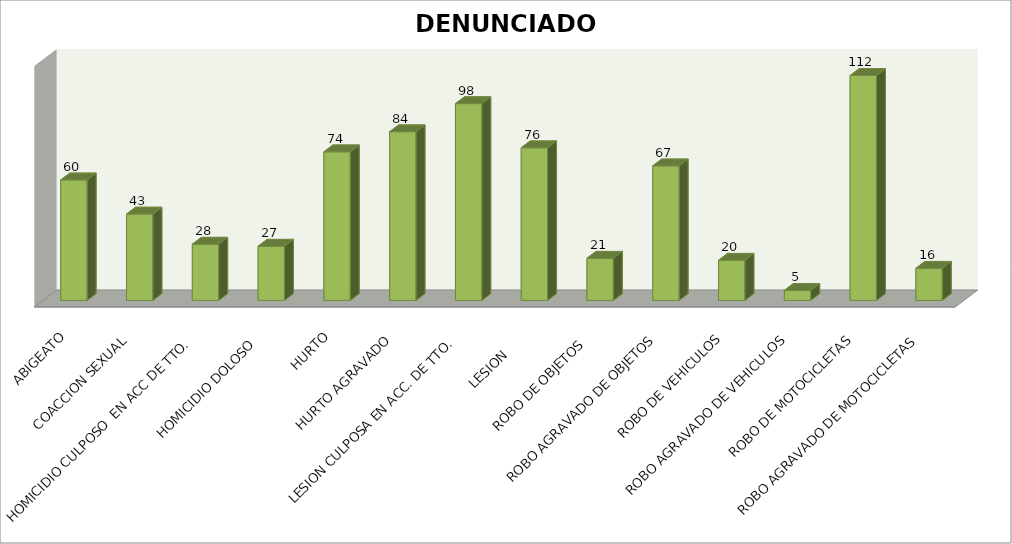
| Category | DENUNCIADOS |
|---|---|
| ABIGEATO | 60 |
| COACCION SEXUAL | 43 |
| HOMICIDIO CULPOSO  EN ACC DE TTO.  | 28 |
| HOMICIDIO DOLOSO  | 27 |
| HURTO | 74 |
| HURTO AGRAVADO | 84 |
| LESION CULPOSA EN ACC. DE TTO. | 98 |
| LESION      | 76 |
| ROBO DE OBJETOS  | 21 |
| ROBO AGRAVADO DE OBJETOS | 67 |
| ROBO DE VEHICULOS | 20 |
| ROBO AGRAVADO DE VEHICULOS | 5 |
| ROBO DE MOTOCICLETAS | 112 |
| ROBO AGRAVADO DE MOTOCICLETAS | 16 |